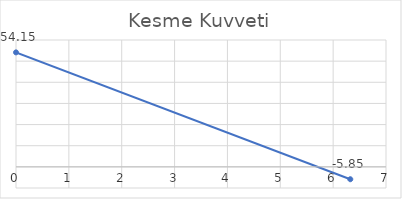
| Category | Series 0 |
|---|---|
| 0.0 | 54.147 |
| 6.324555320336759 | -5.853 |